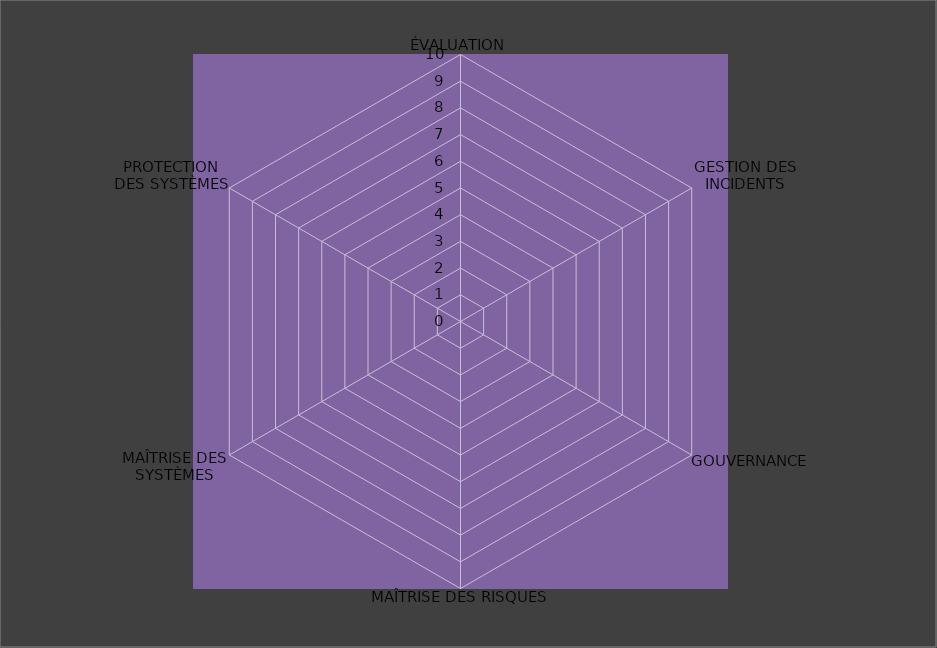
| Category | Année 2026 |
|---|---|
| ÉVALUATION | 0 |
| GESTION DES INCIDENTS | 0 |
| GOUVERNANCE | 0 |
| MAÎTRISE DES RISQUES | 0 |
| MAÎTRISE DES SYSTÈMES | 0 |
| PROTECTION
DES SYSTÈMES | 0 |